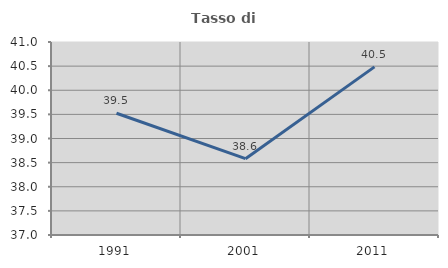
| Category | Tasso di occupazione   |
|---|---|
| 1991.0 | 39.523 |
| 2001.0 | 38.581 |
| 2011.0 | 40.485 |